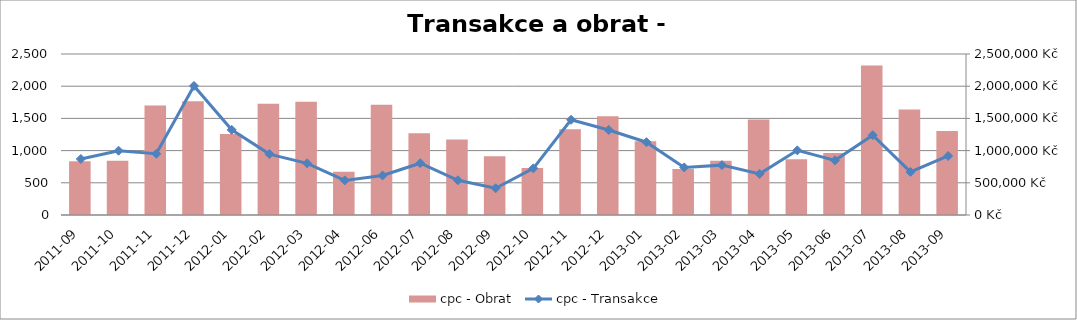
| Category | cpc - Obrat |
|---|---|
| 2011-09 | 835188.604 |
| 2011-10 | 840563.397 |
| 2011-11 | 1700967.096 |
| 2011-12 | 1766352.186 |
| 2012-01 | 1256377.843 |
| 2012-02 | 1727304.539 |
| 2012-03 | 1759024.795 |
| 2012-04 | 673208.93 |
| 2012-06 | 1710651.299 |
| 2012-07 | 1269661.934 |
| 2012-08 | 1174054.464 |
| 2012-09 | 911382.907 |
| 2012-10 | 730670.406 |
| 2012-11 | 1331046.485 |
| 2012-12 | 1533198.447 |
| 2013-01 | 1143577.551 |
| 2013-02 | 715114.557 |
| 2013-03 | 840721.896 |
| 2013-04 | 1484790.824 |
| 2013-05 | 864370.15 |
| 2013-06 | 963783.263 |
| 2013-07 | 2319694.271 |
| 2013-08 | 1637535.885 |
| 2013-09 | 1303238.613 |